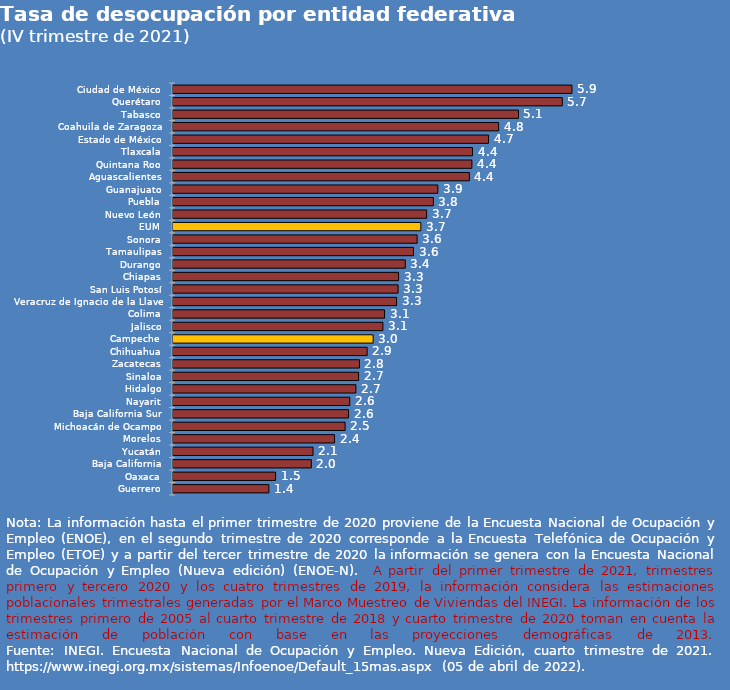
| Category | Series 0 |
|---|---|
| Ciudad de México | 5.892 |
| Querétaro | 5.749 |
| Tabasco | 5.102 |
| Coahuila de Zaragoza | 4.809 |
| Estado de México | 4.659 |
| Tlaxcala | 4.423 |
| Quintana Roo | 4.414 |
| Aguascalientes | 4.377 |
| Guanajuato | 3.911 |
| Puebla | 3.845 |
| Nuevo León | 3.746 |
| EUM | 3.66 |
| Sonora | 3.605 |
| Tamaulipas | 3.552 |
| Durango | 3.431 |
| Chiapas | 3.331 |
| San Luis Potosí | 3.324 |
| Veracruz de Ignacio de la Llave | 3.302 |
| Colima | 3.124 |
| Jalisco | 3.1 |
| Campeche | 2.956 |
| Chihuahua | 2.867 |
| Zacatecas | 2.754 |
| Sinaloa | 2.741 |
| Hidalgo | 2.701 |
| Nayarit | 2.61 |
| Baja California Sur | 2.592 |
| Michoacán de Ocampo | 2.542 |
| Morelos | 2.386 |
| Yucatán | 2.068 |
| Baja California | 2.043 |
| Oaxaca | 1.514 |
| Guerrero | 1.416 |